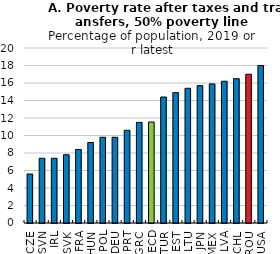
| Category | Poverty rate, after taxes and transfers |
|---|---|
| CZE | 5.6 |
| SVN | 7.4 |
| IRL | 7.4 |
| SVK | 7.8 |
| FRA | 8.4 |
| HUN | 9.2 |
| POL | 9.8 |
| DEU | 9.8 |
| PRT | 10.6 |
| GRC | 11.5 |
| OECD | 11.541 |
| TUR | 14.4 |
| EST | 14.9 |
| LTU | 15.4 |
| JPN | 15.7 |
| MEX | 15.9 |
| LVA | 16.2 |
| CHL | 16.5 |
| ROU | 17 |
| USA | 18 |